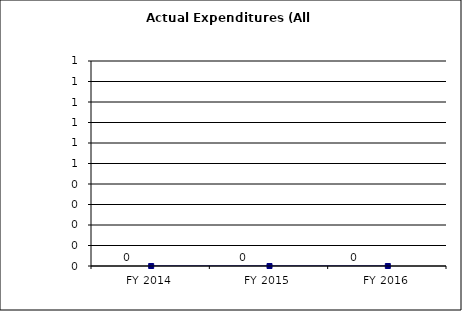
| Category | Actual Expenditures (All Funds) |
|---|---|
| FY 2014 | 0 |
| FY 2015 | 0 |
| FY 2016 | 0 |